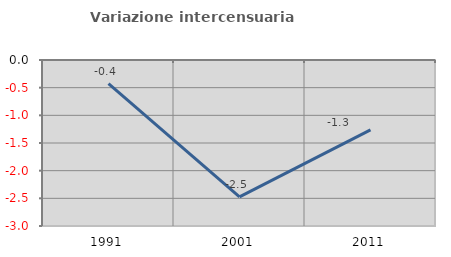
| Category | Variazione intercensuaria annua |
|---|---|
| 1991.0 | -0.428 |
| 2001.0 | -2.475 |
| 2011.0 | -1.261 |